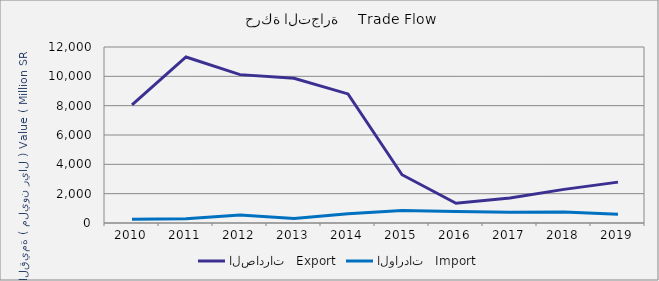
| Category | الصادرات   Export | الواردات   Import |
|---|---|---|
| 2010.0 | 8052891625 | 253474324 |
| 2011.0 | 11318105347 | 297469635 |
| 2012.0 | 10116574520 | 538073582 |
| 2013.0 | 9866215725 | 313799131 |
| 2014.0 | 8800622092 | 636507224 |
| 2015.0 | 3292264174 | 857952385 |
| 2016.0 | 1345268183 | 775676995 |
| 2017.0 | 1703841256 | 738523854 |
| 2018.0 | 2293279135 | 750239274 |
| 2019.0 | 2786572012 | 600153342 |